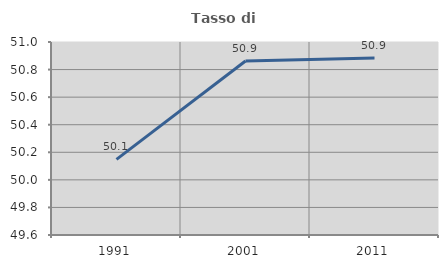
| Category | Tasso di occupazione   |
|---|---|
| 1991.0 | 50.149 |
| 2001.0 | 50.862 |
| 2011.0 | 50.884 |